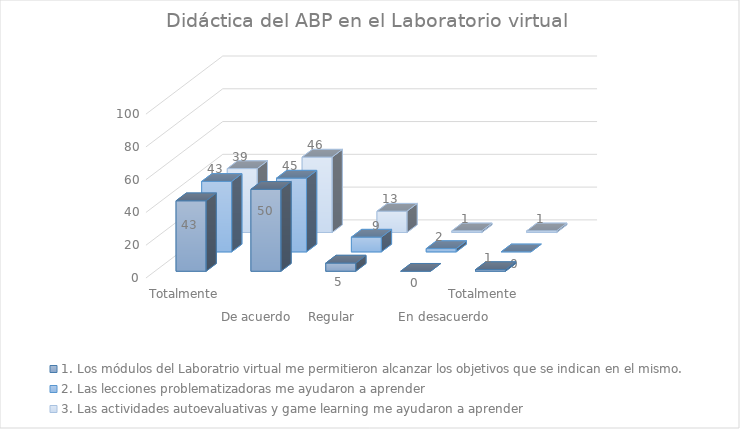
| Category | 1. Los módulos del Laboratrio virtual me permitieron alcanzar los objetivos que se indican en el mismo. | 2. Las lecciones problematizadoras me ayudaron a aprender | 3. Las actividades autoevaluativas y game learning me ayudaron a aprender  |
|---|---|---|---|
| 0 | 43 | 43 | 39 |
| 1 | 50 | 45 | 46 |
| 2 | 5 | 9 | 13 |
| 3 | 0 | 2 | 1 |
| 4 | 1 | 0 | 1 |